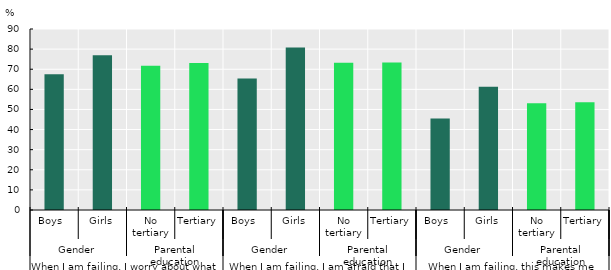
| Category | Series 0 |
|---|---|
| 0 | 67.473 |
| 1 | 76.899 |
| 2 | 71.702 |
| 3 | 73.145 |
| 4 | 65.432 |
| 5 | 80.828 |
| 6 | 73.246 |
| 7 | 73.339 |
| 8 | 45.472 |
| 9 | 61.328 |
| 10 | 53.104 |
| 11 | 53.54 |